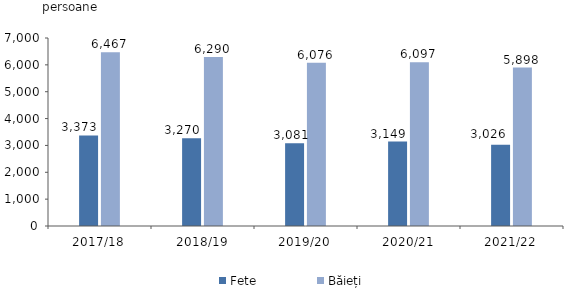
| Category | Fete  | Băieți |
|---|---|---|
| 2017/18 | 3373 | 6467 |
| 2018/19 | 3270 | 6290 |
| 2019/20 | 3081 | 6076 |
| 2020/21 | 3149 | 6097 |
| 2021/22 | 3026 | 5898 |